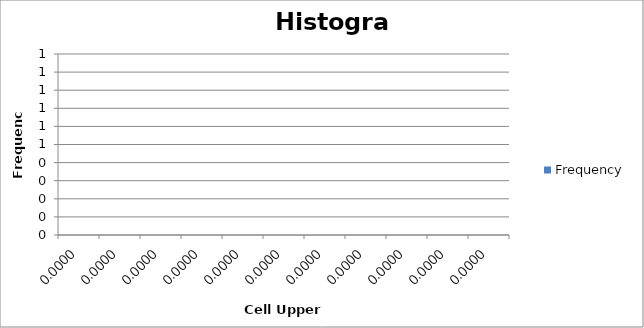
| Category | Frequency |
|---|---|
| 0.0 | 0 |
| 0.0 | 0 |
| 0.0 | 0 |
| 0.0 | 0 |
| 0.0 | 0 |
| 0.0 | 0 |
| 0.0 | 0 |
| 0.0 | 0 |
| 0.0 | 0 |
| 0.0 | 0 |
| 0.0 | 0 |